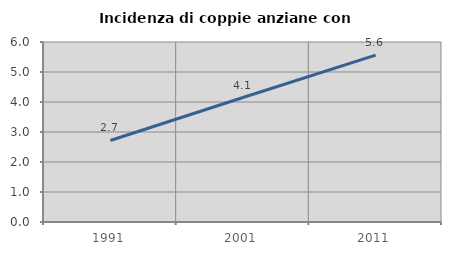
| Category | Incidenza di coppie anziane con figli |
|---|---|
| 1991.0 | 2.718 |
| 2001.0 | 4.149 |
| 2011.0 | 5.564 |